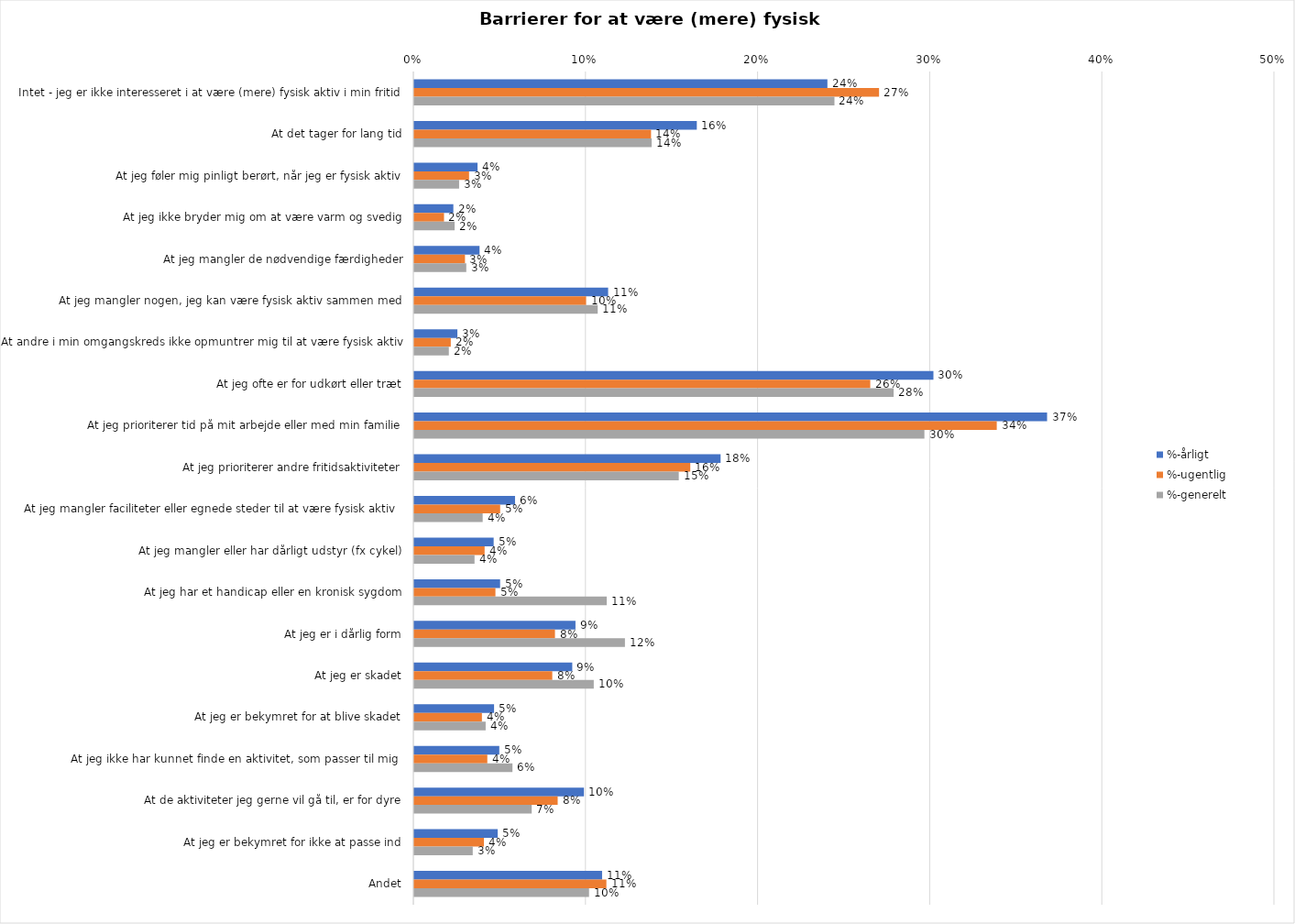
| Category | %-årligt | %-ugentlig | %-generelt |
|---|---|---|---|
| Intet - jeg er ikke interesseret i at være (mere) fysisk aktiv i min fritid | 0.24 | 0.27 | 0.244 |
| At det tager for lang tid | 0.164 | 0.138 | 0.138 |
| At jeg føler mig pinligt berørt, når jeg er fysisk aktiv | 0.037 | 0.032 | 0.026 |
| At jeg ikke bryder mig om at være varm og svedig | 0.023 | 0.017 | 0.023 |
| At jeg mangler de nødvendige færdigheder | 0.038 | 0.029 | 0.03 |
| At jeg mangler nogen, jeg kan være fysisk aktiv sammen med | 0.113 | 0.1 | 0.107 |
| At andre i min omgangskreds ikke opmuntrer mig til at være fysisk aktiv | 0.025 | 0.021 | 0.02 |
| At jeg ofte er for udkørt eller træt | 0.302 | 0.265 | 0.279 |
| At jeg prioriterer tid på mit arbejde eller med min familie | 0.368 | 0.338 | 0.296 |
| At jeg prioriterer andre fritidsaktiviteter | 0.178 | 0.16 | 0.154 |
| At jeg mangler faciliteter eller egnede steder til at være fysisk aktiv  | 0.059 | 0.05 | 0.04 |
| At jeg mangler eller har dårligt udstyr (fx cykel) | 0.046 | 0.041 | 0.035 |
| At jeg har et handicap eller en kronisk sygdom | 0.05 | 0.047 | 0.112 |
| At jeg er i dårlig form | 0.094 | 0.082 | 0.122 |
| At jeg er skadet | 0.092 | 0.08 | 0.104 |
| At jeg er bekymret for at blive skadet | 0.046 | 0.039 | 0.041 |
| At jeg ikke har kunnet finde en aktivitet, som passer til mig  | 0.049 | 0.042 | 0.057 |
| At de aktiviteter jeg gerne vil gå til, er for dyre | 0.099 | 0.083 | 0.068 |
| At jeg er bekymret for ikke at passe ind | 0.048 | 0.04 | 0.034 |
| Andet | 0.109 | 0.112 | 0.102 |